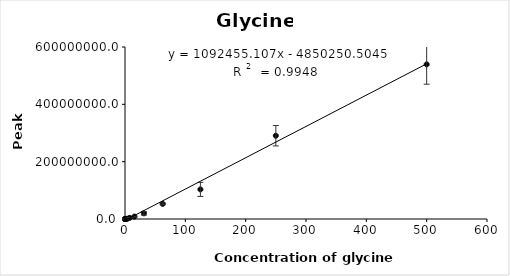
| Category | Series 0 |
|---|---|
| 0.03 | 9295 |
| 0.06 | 10404 |
| 0.12 | 14288.333 |
| 0.24 | 8939.333 |
| 0.49 | 16367.667 |
| 0.98 | 339517 |
| 1.95 | 158140 |
| 3.9 | 935002 |
| 7.81 | 4052426.667 |
| 15.6 | 8451779.333 |
| 31.3 | 19735729 |
| 62.5 | 52835468 |
| 125.0 | 103245280 |
| 250.0 | 290491301.333 |
| 500.0 | 539375562.667 |